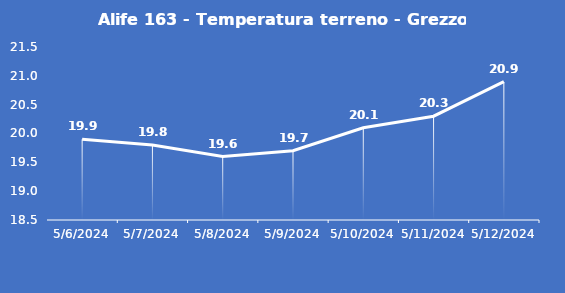
| Category | Alife 163 - Temperatura terreno - Grezzo (°C) |
|---|---|
| 5/6/24 | 19.9 |
| 5/7/24 | 19.8 |
| 5/8/24 | 19.6 |
| 5/9/24 | 19.7 |
| 5/10/24 | 20.1 |
| 5/11/24 | 20.3 |
| 5/12/24 | 20.9 |